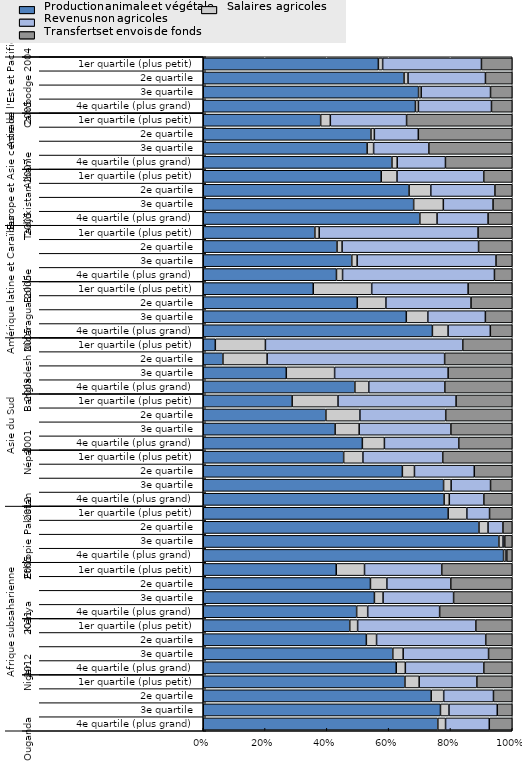
| Category | Production végétale et animale | Salaires agricoles | Revenus non agricoles | Transferts et envois de fonds
 |
|---|---|---|---|---|
| 0 | 0.759 | 0.025 | 0.142 | 0.074 |
| 1 | 0.768 | 0.027 | 0.156 | 0.048 |
| 2 | 0.738 | 0.041 | 0.161 | 0.061 |
| 3 | 0.653 | 0.046 | 0.187 | 0.115 |
| 4 | 0.625 | 0.029 | 0.254 | 0.092 |
| 5 | 0.613 | 0.034 | 0.276 | 0.077 |
| 6 | 0.528 | 0.033 | 0.353 | 0.086 |
| 7 | 0.474 | 0.026 | 0.382 | 0.118 |
| 8 | 0.496 | 0.036 | 0.233 | 0.235 |
| 9 | 0.554 | 0.028 | 0.228 | 0.19 |
| 10 | 0.541 | 0.053 | 0.207 | 0.199 |
| 11 | 0.43 | 0.092 | 0.25 | 0.228 |
| 12 | 0.977 | 0.008 | 0.003 | 0.018 |
| 13 | 0.957 | 0.013 | 0.006 | 0.024 |
| 14 | 0.892 | 0.029 | 0.048 | 0.03 |
| 15 | 0.793 | 0.06 | 0.073 | 0.073 |
| 16 | 0.779 | 0.017 | 0.112 | 0.092 |
| 17 | 0.778 | 0.024 | 0.128 | 0.07 |
| 18 | 0.644 | 0.039 | 0.194 | 0.123 |
| 19 | 0.454 | 0.062 | 0.258 | 0.225 |
| 20 | 0.515 | 0.071 | 0.241 | 0.173 |
| 21 | 0.427 | 0.078 | 0.297 | 0.199 |
| 22 | 0.397 | 0.11 | 0.278 | 0.215 |
| 23 | 0.288 | 0.148 | 0.382 | 0.182 |
| 24 | 0.491 | 0.045 | 0.246 | 0.218 |
| 25 | 0.269 | 0.156 | 0.367 | 0.208 |
| 26 | 0.064 | 0.143 | 0.574 | 0.219 |
| 27 | 0.039 | 0.162 | 0.639 | 0.16 |
| 28 | 0.742 | 0.051 | 0.137 | 0.071 |
| 29 | 0.657 | 0.07 | 0.186 | 0.087 |
| 30 | 0.498 | 0.093 | 0.275 | 0.133 |
| 31 | 0.356 | 0.189 | 0.312 | 0.143 |
| 32 | 0.431 | 0.02 | 0.492 | 0.058 |
| 33 | 0.481 | 0.017 | 0.449 | 0.053 |
| 34 | 0.433 | 0.016 | 0.442 | 0.109 |
| 35 | 0.361 | 0.014 | 0.514 | 0.111 |
| 36 | 0.701 | 0.056 | 0.165 | 0.078 |
| 37 | 0.681 | 0.096 | 0.161 | 0.062 |
| 38 | 0.666 | 0.07 | 0.207 | 0.056 |
| 39 | 0.576 | 0.051 | 0.281 | 0.092 |
| 40 | 0.611 | 0.017 | 0.156 | 0.216 |
| 41 | 0.53 | 0.021 | 0.179 | 0.27 |
| 42 | 0.543 | 0.011 | 0.142 | 0.304 |
| 43 | 0.38 | 0.031 | 0.247 | 0.342 |
| 44 | 0.687 | 0.01 | 0.237 | 0.067 |
| 45 | 0.697 | 0.008 | 0.224 | 0.07 |
| 46 | 0.65 | 0.013 | 0.251 | 0.087 |
| 47 | 0.567 | 0.014 | 0.32 | 0.1 |